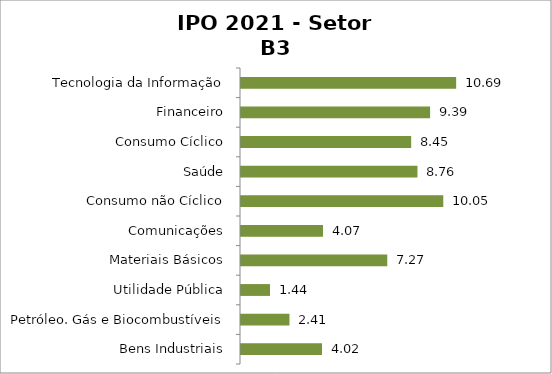
| Category | Volume (R$) |
|---|---|
| Tecnologia da Informação | 10687095095.4 |
| Financeiro | 9391598039.32 |
| Consumo Cíclico | 8452320340.2 |
| Saúde | 8764854521.68 |
| Consumo não Cíclico | 10047142105.8 |
| Comunicações | 4072426585.12 |
| Materiais Básicos | 7265251970.4 |
| Utilidade Pública | 1441354503.64 |
| Petróleo. Gás e Biocombustíveis | 2407374996 |
| Bens Industriais | 4021961307.89 |